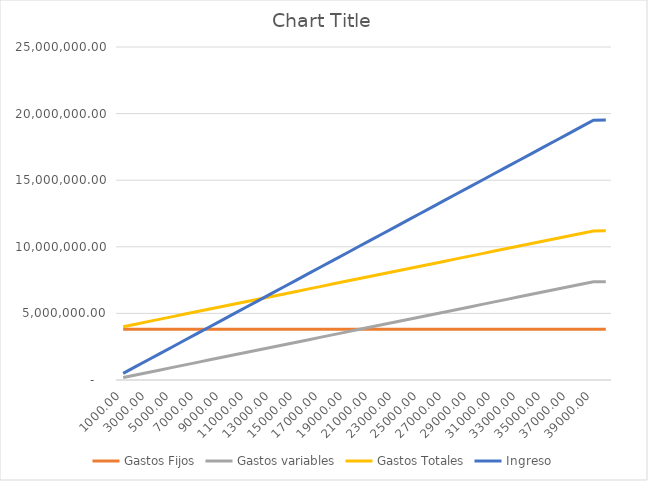
| Category | Gastos Fijos | Gastos variables | Gastos Totales | Ingreso |
|---|---|---|---|---|
| 1000.0 | 3812848.12 | 189223.488 | 4002071.608 | 500000 |
| 2000.0 | 3812848.12 | 378446.976 | 4191295.096 | 1000000 |
| 3000.0 | 3812848.12 | 567670.465 | 4380518.585 | 1500000 |
| 4000.0 | 3812848.12 | 756893.953 | 4569742.073 | 2000000 |
| 5000.0 | 3812848.12 | 946117.441 | 4758965.561 | 2500000 |
| 6000.0 | 3812848.12 | 1135340.929 | 4948189.049 | 3000000 |
| 7000.0 | 3812848.12 | 1324564.418 | 5137412.538 | 3500000 |
| 8000.0 | 3812848.12 | 1513787.906 | 5326636.026 | 4000000 |
| 9000.0 | 3812848.12 | 1703011.394 | 5515859.514 | 4500000 |
| 10000.0 | 3812848.12 | 1892234.882 | 5705083.002 | 5000000 |
| 11000.0 | 3812848.12 | 2081458.37 | 5894306.49 | 5500000 |
| 12000.0 | 3812848.12 | 2270681.859 | 6083529.979 | 6000000 |
| 13000.0 | 3812848.12 | 2459905.347 | 6272753.467 | 6500000 |
| 14000.0 | 3812848.12 | 2649128.835 | 6461976.955 | 7000000 |
| 15000.0 | 3812848.12 | 2838352.323 | 6651200.443 | 7500000 |
| 16000.0 | 3812848.12 | 3027575.812 | 6840423.932 | 8000000 |
| 17000.0 | 3812848.12 | 3216799.3 | 7029647.42 | 8500000 |
| 18000.0 | 3812848.12 | 3406022.788 | 7218870.908 | 9000000 |
| 19000.0 | 3812848.12 | 3595246.276 | 7408094.396 | 9500000 |
| 20000.0 | 3812848.12 | 3784469.764 | 7597317.884 | 10000000 |
| 21000.0 | 3812848.12 | 3973693.253 | 7786541.373 | 10500000 |
| 22000.0 | 3812848.12 | 4162916.741 | 7975764.861 | 11000000 |
| 23000.0 | 3812848.12 | 4352140.229 | 8164988.349 | 11500000 |
| 24000.0 | 3812848.12 | 4541363.717 | 8354211.837 | 12000000 |
| 25000.0 | 3812848.12 | 4730587.206 | 8543435.326 | 12500000 |
| 26000.0 | 3812848.12 | 4919810.694 | 8732658.814 | 13000000 |
| 27000.0 | 3812848.12 | 5109034.182 | 8921882.302 | 13500000 |
| 28000.0 | 3812848.12 | 5298257.67 | 9111105.79 | 14000000 |
| 29000.0 | 3812848.12 | 5487481.158 | 9300329.278 | 14500000 |
| 30000.0 | 3812848.12 | 5676704.647 | 9489552.767 | 15000000 |
| 31000.0 | 3812848.12 | 5865928.135 | 9678776.255 | 15500000 |
| 32000.0 | 3812848.12 | 6055151.623 | 9867999.743 | 16000000 |
| 33000.0 | 3812848.12 | 6244375.111 | 10057223.231 | 16500000 |
| 34000.0 | 3812848.12 | 6433598.599 | 10246446.72 | 17000000 |
| 35000.0 | 3812848.12 | 6622822.088 | 10435670.208 | 17500000 |
| 36000.0 | 3812848.12 | 6812045.576 | 10624893.696 | 18000000 |
| 37000.0 | 3812848.12 | 7001269.064 | 10814117.184 | 18500000 |
| 38000.0 | 3812848.12 | 7190492.552 | 11003340.672 | 19000000 |
| 39000.0 | 3812848.12 | 7379716.041 | 11192564.161 | 19500000 |
| 39021.0 | 3812848.12 | 7383689.734 | 11196537.854 | 19510500 |